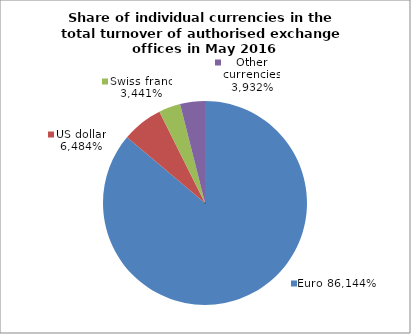
| Category | EUR |
|---|---|
| 0 | 0.861 |
| 1 | 0.065 |
| 2 | 0.034 |
| 3 | 0.039 |